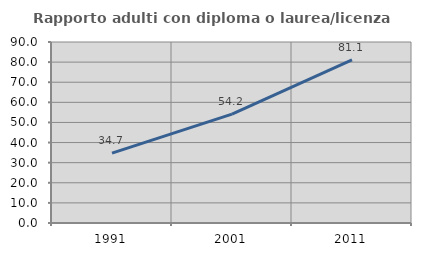
| Category | Rapporto adulti con diploma o laurea/licenza media  |
|---|---|
| 1991.0 | 34.741 |
| 2001.0 | 54.16 |
| 2011.0 | 81.129 |